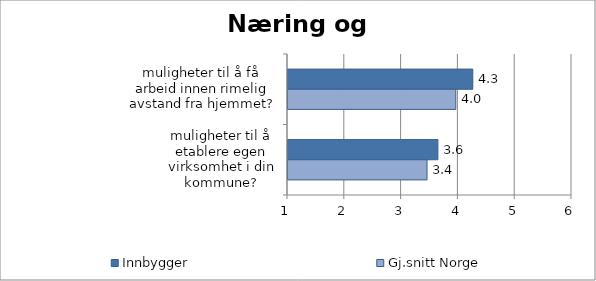
| Category | Innbygger | Gj.snitt Norge |
|---|---|---|
| muligheter til å få arbeid innen rimelig avstand fra hjemmet? | 4.253 | 3.954 |
| muligheter til å etablere egen virksomhet i din kommune? | 3.639 | 3.448 |